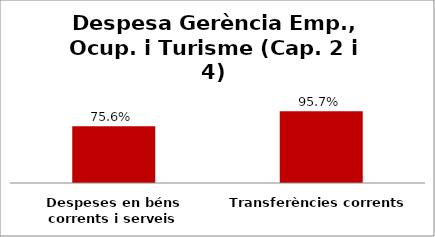
| Category | Series 0 |
|---|---|
| Despeses en béns corrents i serveis | 0.756 |
| Transferències corrents | 0.957 |